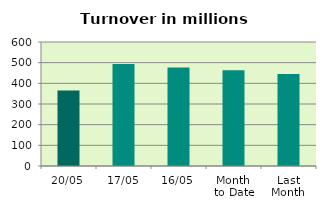
| Category | Series 0 |
|---|---|
| 20/05 | 365.288 |
| 17/05 | 493.06 |
| 16/05 | 476.755 |
| Month 
to Date | 463.81 |
| Last
Month | 444.663 |